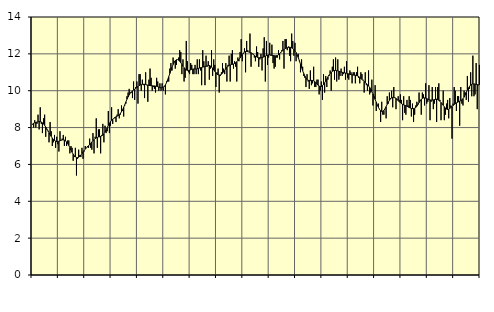
| Category | Piggar | Series 1 |
|---|---|---|
| nan | 8.2 | 8.17 |
| 87.0 | 8 | 8.24 |
| 87.0 | 8.4 | 8.26 |
| 87.0 | 8 | 8.28 |
| 87.0 | 8.2 | 8.3 |
| 87.0 | 8.7 | 8.32 |
| 87.0 | 7.9 | 8.33 |
| 87.0 | 9.1 | 8.32 |
| 87.0 | 8.2 | 8.3 |
| 87.0 | 7.7 | 8.26 |
| 87.0 | 8.5 | 8.2 |
| 87.0 | 8.7 | 8.12 |
| nan | 7.5 | 8.03 |
| 88.0 | 7.9 | 7.93 |
| 88.0 | 7.8 | 7.83 |
| 88.0 | 7.2 | 7.72 |
| 88.0 | 8.3 | 7.62 |
| 88.0 | 7.8 | 7.52 |
| 88.0 | 7 | 7.43 |
| 88.0 | 7.2 | 7.35 |
| 88.0 | 7.6 | 7.3 |
| 88.0 | 6.9 | 7.26 |
| 88.0 | 7.5 | 7.24 |
| 88.0 | 7.1 | 7.24 |
| nan | 6.7 | 7.26 |
| 89.0 | 7.8 | 7.28 |
| 89.0 | 7.3 | 7.31 |
| 89.0 | 7.4 | 7.33 |
| 89.0 | 7.6 | 7.33 |
| 89.0 | 7 | 7.32 |
| 89.0 | 7.5 | 7.28 |
| 89.0 | 7 | 7.22 |
| 89.0 | 7.3 | 7.13 |
| 89.0 | 7.3 | 7.03 |
| 89.0 | 6.6 | 6.91 |
| 89.0 | 7 | 6.78 |
| nan | 6.9 | 6.66 |
| 90.0 | 6.2 | 6.56 |
| 90.0 | 6.4 | 6.47 |
| 90.0 | 6.9 | 6.41 |
| 90.0 | 5.4 | 6.37 |
| 90.0 | 6.3 | 6.37 |
| 90.0 | 6.8 | 6.39 |
| 90.0 | 6.5 | 6.44 |
| 90.0 | 6.4 | 6.51 |
| 90.0 | 6.9 | 6.59 |
| 90.0 | 6.3 | 6.68 |
| 90.0 | 6.7 | 6.76 |
| nan | 7 | 6.83 |
| 91.0 | 6.9 | 6.89 |
| 91.0 | 7 | 6.95 |
| 91.0 | 6.9 | 7.01 |
| 91.0 | 7.4 | 7.07 |
| 91.0 | 6.9 | 7.14 |
| 91.0 | 6.8 | 7.22 |
| 91.0 | 7.7 | 7.28 |
| 91.0 | 6.6 | 7.34 |
| 91.0 | 7.5 | 7.4 |
| 91.0 | 8.5 | 7.44 |
| 91.0 | 6.9 | 7.46 |
| nan | 7.9 | 7.49 |
| 92.0 | 7.9 | 7.5 |
| 92.0 | 6.6 | 7.52 |
| 92.0 | 7.6 | 7.55 |
| 92.0 | 8.2 | 7.59 |
| 92.0 | 7.2 | 7.66 |
| 92.0 | 8.1 | 7.76 |
| 92.0 | 7.7 | 7.87 |
| 92.0 | 7.8 | 7.99 |
| 92.0 | 8.9 | 8.12 |
| 92.0 | 7.7 | 8.23 |
| 92.0 | 8.1 | 8.32 |
| nan | 9.1 | 8.39 |
| 93.0 | 8.2 | 8.45 |
| 93.0 | 8.5 | 8.5 |
| 93.0 | 8.5 | 8.55 |
| 93.0 | 8.3 | 8.58 |
| 93.0 | 8.7 | 8.62 |
| 93.0 | 9 | 8.65 |
| 93.0 | 8.5 | 8.7 |
| 93.0 | 8.7 | 8.77 |
| 93.0 | 9.2 | 8.86 |
| 93.0 | 8.9 | 8.97 |
| 93.0 | 8.6 | 9.1 |
| nan | 9.2 | 9.24 |
| 94.0 | 9.3 | 9.39 |
| 94.0 | 9.7 | 9.54 |
| 94.0 | 9.9 | 9.66 |
| 94.0 | 10.1 | 9.78 |
| 94.0 | 9.9 | 9.87 |
| 94.0 | 9.9 | 9.94 |
| 94.0 | 9.6 | 9.99 |
| 94.0 | 10.5 | 10.04 |
| 94.0 | 9.5 | 10.08 |
| 94.0 | 10.2 | 10.13 |
| 94.0 | 10.5 | 10.18 |
| nan | 9.3 | 10.23 |
| 95.0 | 10.9 | 10.27 |
| 95.0 | 10.9 | 10.31 |
| 95.0 | 10 | 10.33 |
| 95.0 | 10.6 | 10.35 |
| 95.0 | 10.3 | 10.35 |
| 95.0 | 9.6 | 10.35 |
| 95.0 | 11 | 10.34 |
| 95.0 | 10.3 | 10.32 |
| 95.0 | 9.4 | 10.3 |
| 95.0 | 10.6 | 10.29 |
| 95.0 | 11.2 | 10.28 |
| nan | 10.7 | 10.27 |
| 96.0 | 10 | 10.27 |
| 96.0 | 10.2 | 10.26 |
| 96.0 | 10.1 | 10.26 |
| 96.0 | 9.9 | 10.25 |
| 96.0 | 10.7 | 10.24 |
| 96.0 | 10.5 | 10.22 |
| 96.0 | 10 | 10.2 |
| 96.0 | 10.4 | 10.18 |
| 96.0 | 10 | 10.16 |
| 96.0 | 10.4 | 10.16 |
| 96.0 | 10 | 10.18 |
| nan | 10.2 | 10.23 |
| 97.0 | 9.8 | 10.31 |
| 97.0 | 10.5 | 10.44 |
| 97.0 | 10.5 | 10.59 |
| 97.0 | 10.5 | 10.76 |
| 97.0 | 11.2 | 10.93 |
| 97.0 | 11.5 | 11.1 |
| 97.0 | 11.1 | 11.27 |
| 97.0 | 11.8 | 11.42 |
| 97.0 | 11.6 | 11.54 |
| 97.0 | 11.2 | 11.63 |
| 97.0 | 11.4 | 11.68 |
| nan | 11.7 | 11.69 |
| 98.0 | 11.8 | 11.66 |
| 98.0 | 12.2 | 11.6 |
| 98.0 | 12.1 | 11.52 |
| 98.0 | 10.9 | 11.43 |
| 98.0 | 11.7 | 11.33 |
| 98.0 | 10.5 | 11.25 |
| 98.0 | 10.7 | 11.18 |
| 98.0 | 12.7 | 11.13 |
| 98.0 | 11.6 | 11.1 |
| 98.0 | 11 | 11.09 |
| 98.0 | 10.9 | 11.11 |
| nan | 11.5 | 11.13 |
| 99.0 | 11.4 | 11.16 |
| 99.0 | 10.9 | 11.17 |
| 99.0 | 10.9 | 11.18 |
| 99.0 | 11.4 | 11.18 |
| 99.0 | 10.9 | 11.18 |
| 99.0 | 11.7 | 11.19 |
| 99.0 | 10.9 | 11.21 |
| 99.0 | 11.7 | 11.23 |
| 99.0 | 11.1 | 11.25 |
| 99.0 | 10.3 | 11.26 |
| 99.0 | 12.2 | 11.28 |
| nan | 11.6 | 11.3 |
| 0.0 | 10.3 | 11.31 |
| 0.0 | 11.9 | 11.33 |
| 0.0 | 11.3 | 11.35 |
| 0.0 | 11.6 | 11.37 |
| 0.0 | 10.6 | 11.37 |
| 0.0 | 11.2 | 11.34 |
| 0.0 | 12.2 | 11.29 |
| 0.0 | 10.8 | 11.22 |
| 0.0 | 11.7 | 11.13 |
| 0.0 | 11.4 | 11.05 |
| 0.0 | 10.2 | 10.97 |
| nan | 11 | 10.9 |
| 1.0 | 11.2 | 10.86 |
| 1.0 | 9.9 | 10.85 |
| 1.0 | 10.8 | 10.86 |
| 1.0 | 11 | 10.89 |
| 1.0 | 11.5 | 10.95 |
| 1.0 | 11.2 | 11.02 |
| 1.0 | 10.9 | 11.1 |
| 1.0 | 11.5 | 11.19 |
| 1.0 | 10.5 | 11.27 |
| 1.0 | 11.4 | 11.33 |
| 1.0 | 11.9 | 11.37 |
| nan | 10.5 | 11.4 |
| 2.0 | 12 | 11.42 |
| 2.0 | 12.2 | 11.43 |
| 2.0 | 11.2 | 11.45 |
| 2.0 | 11.6 | 11.48 |
| 2.0 | 11.3 | 11.52 |
| 2.0 | 10.5 | 11.57 |
| 2.0 | 11.8 | 11.63 |
| 2.0 | 11.6 | 11.7 |
| 2.0 | 12.1 | 11.78 |
| 2.0 | 12.8 | 11.88 |
| 2.0 | 11.6 | 11.96 |
| nan | 12 | 12.04 |
| 3.0 | 12.3 | 12.1 |
| 3.0 | 11 | 12.13 |
| 3.0 | 12.7 | 12.13 |
| 3.0 | 12.2 | 12.12 |
| 3.0 | 12.1 | 12.1 |
| 3.0 | 13.1 | 12.08 |
| 3.0 | 11.3 | 12.06 |
| 3.0 | 12 | 12.02 |
| 3.0 | 12 | 11.97 |
| 3.0 | 11.8 | 11.92 |
| 3.0 | 11.6 | 11.87 |
| nan | 12.4 | 11.84 |
| 4.0 | 12.1 | 11.81 |
| 4.0 | 11.3 | 11.79 |
| 4.0 | 11.7 | 11.79 |
| 4.0 | 12 | 11.79 |
| 4.0 | 11.1 | 11.8 |
| 4.0 | 12.3 | 11.82 |
| 4.0 | 12.9 | 11.85 |
| 4.0 | 10.5 | 11.88 |
| 4.0 | 12.7 | 11.91 |
| 4.0 | 11.4 | 11.93 |
| 4.0 | 11.8 | 11.95 |
| nan | 12.6 | 11.95 |
| 5.0 | 11.9 | 11.94 |
| 5.0 | 12.5 | 11.92 |
| 5.0 | 11.5 | 11.91 |
| 5.0 | 11.2 | 11.9 |
| 5.0 | 11.3 | 11.89 |
| 5.0 | 11.8 | 11.9 |
| 5.0 | 11.8 | 11.91 |
| 5.0 | 12.2 | 11.95 |
| 5.0 | 11.7 | 12.01 |
| 5.0 | 12.1 | 12.07 |
| 5.0 | 12.2 | 12.14 |
| nan | 12.7 | 12.19 |
| 6.0 | 11.2 | 12.24 |
| 6.0 | 12.8 | 12.28 |
| 6.0 | 12.8 | 12.31 |
| 6.0 | 12.2 | 12.33 |
| 6.0 | 12.4 | 12.35 |
| 6.0 | 11.9 | 12.36 |
| 6.0 | 11.6 | 12.35 |
| 6.0 | 13.1 | 12.33 |
| 6.0 | 12.7 | 12.29 |
| 6.0 | 11.9 | 12.24 |
| 6.0 | 12.6 | 12.16 |
| nan | 11.6 | 12.07 |
| 7.0 | 11.9 | 11.94 |
| 7.0 | 12 | 11.8 |
| 7.0 | 11.6 | 11.63 |
| 7.0 | 11 | 11.44 |
| 7.0 | 11.7 | 11.26 |
| 7.0 | 11.3 | 11.08 |
| 7.0 | 10.8 | 10.93 |
| 7.0 | 10.7 | 10.8 |
| 7.0 | 10.2 | 10.69 |
| 7.0 | 10.9 | 10.61 |
| 7.0 | 10.5 | 10.57 |
| nan | 10.1 | 10.55 |
| 8.0 | 11.1 | 10.55 |
| 8.0 | 10.3 | 10.56 |
| 8.0 | 10.4 | 10.55 |
| 8.0 | 11.3 | 10.54 |
| 8.0 | 10.2 | 10.5 |
| 8.0 | 10.2 | 10.44 |
| 8.0 | 10.6 | 10.37 |
| 8.0 | 10.6 | 10.3 |
| 8.0 | 9.8 | 10.25 |
| 8.0 | 10 | 10.23 |
| 8.0 | 10.5 | 10.23 |
| nan | 9.5 | 10.27 |
| 9.0 | 10.9 | 10.34 |
| 9.0 | 9.9 | 10.43 |
| 9.0 | 10.8 | 10.53 |
| 9.0 | 10.2 | 10.64 |
| 9.0 | 10.6 | 10.75 |
| 9.0 | 10.8 | 10.85 |
| 9.0 | 11.1 | 10.94 |
| 9.0 | 10 | 11 |
| 9.0 | 11.3 | 11.05 |
| 9.0 | 11.7 | 11.08 |
| 9.0 | 10.6 | 11.1 |
| nan | 11.8 | 11.1 |
| 10.0 | 10.5 | 11.09 |
| 10.0 | 11.7 | 11.08 |
| 10.0 | 10.6 | 11.06 |
| 10.0 | 10.8 | 11.03 |
| 10.0 | 11.2 | 11.01 |
| 10.0 | 10.8 | 11 |
| 10.0 | 10.9 | 10.98 |
| 10.0 | 11.3 | 10.97 |
| 10.0 | 10.6 | 10.96 |
| 10.0 | 11.6 | 10.95 |
| 10.0 | 10.7 | 10.93 |
| nan | 10.6 | 10.91 |
| 11.0 | 11.1 | 10.89 |
| 11.0 | 11 | 10.87 |
| 11.0 | 10.4 | 10.86 |
| 11.0 | 11 | 10.85 |
| 11.0 | 11 | 10.84 |
| 11.0 | 10.4 | 10.84 |
| 11.0 | 11 | 10.82 |
| 11.0 | 11.3 | 10.8 |
| 11.0 | 10.7 | 10.77 |
| 11.0 | 10.4 | 10.72 |
| 11.0 | 11 | 10.67 |
| nan | 10.9 | 10.62 |
| 12.0 | 10.6 | 10.56 |
| 12.0 | 9.9 | 10.5 |
| 12.0 | 11 | 10.44 |
| 12.0 | 10.3 | 10.39 |
| 12.0 | 10 | 10.32 |
| 12.0 | 11.1 | 10.26 |
| 12.0 | 9.8 | 10.18 |
| 12.0 | 9.9 | 10.08 |
| 12.0 | 10.6 | 9.96 |
| 12.0 | 9.2 | 9.83 |
| 12.0 | 9.6 | 9.69 |
| nan | 10.3 | 9.53 |
| 13.0 | 8.9 | 9.38 |
| 13.0 | 9.2 | 9.23 |
| 13.0 | 9.3 | 9.1 |
| 13.0 | 9 | 8.99 |
| 13.0 | 8.3 | 8.91 |
| 13.0 | 9.4 | 8.88 |
| 13.0 | 8.7 | 8.88 |
| 13.0 | 8.7 | 8.93 |
| 13.0 | 9 | 9.02 |
| 13.0 | 8.5 | 9.14 |
| 13.0 | 9.7 | 9.26 |
| nan | 9.3 | 9.38 |
| 14.0 | 9.9 | 9.48 |
| 14.0 | 9.6 | 9.56 |
| 14.0 | 10 | 9.61 |
| 14.0 | 9.1 | 9.64 |
| 14.0 | 10.2 | 9.64 |
| 14.0 | 9.6 | 9.62 |
| 14.0 | 9 | 9.58 |
| 14.0 | 9.5 | 9.53 |
| 14.0 | 9.7 | 9.46 |
| 14.0 | 9.5 | 9.4 |
| 14.0 | 9.8 | 9.34 |
| nan | 9.5 | 9.3 |
| 15.0 | 8.4 | 9.26 |
| 15.0 | 9.7 | 9.23 |
| 15.0 | 8.8 | 9.21 |
| 15.0 | 8.7 | 9.19 |
| 15.0 | 9.5 | 9.16 |
| 15.0 | 9.2 | 9.12 |
| 15.0 | 9.7 | 9.09 |
| 15.0 | 9.5 | 9.06 |
| 15.0 | 8.6 | 9.04 |
| 15.0 | 9.3 | 9.03 |
| 15.0 | 8.3 | 9.03 |
| nan | 8.7 | 9.05 |
| 16.0 | 9.2 | 9.09 |
| 16.0 | 9.4 | 9.16 |
| 16.0 | 9.3 | 9.25 |
| 16.0 | 9.9 | 9.35 |
| 16.0 | 9.5 | 9.45 |
| 16.0 | 8.7 | 9.53 |
| 16.0 | 9.9 | 9.58 |
| 16.0 | 9.8 | 9.61 |
| 16.0 | 9.2 | 9.61 |
| 16.0 | 10.4 | 9.6 |
| 16.0 | 9.3 | 9.58 |
| nan | 9.4 | 9.54 |
| 17.0 | 10.3 | 9.52 |
| 17.0 | 8.4 | 9.5 |
| 17.0 | 9.4 | 9.49 |
| 17.0 | 10.2 | 9.49 |
| 17.0 | 9 | 9.5 |
| 17.0 | 9.3 | 9.52 |
| 17.0 | 10.2 | 9.53 |
| 17.0 | 8.3 | 9.54 |
| 17.0 | 10.2 | 9.52 |
| 17.0 | 10.4 | 9.48 |
| 17.0 | 9.5 | 9.43 |
| nan | 8.4 | 9.36 |
| 18.0 | 9.3 | 9.29 |
| 18.0 | 10 | 9.21 |
| 18.0 | 8.4 | 9.13 |
| 18.0 | 8.7 | 9.06 |
| 18.0 | 9.3 | 9 |
| 18.0 | 9.5 | 8.98 |
| 18.0 | 8.5 | 8.99 |
| 18.0 | 9.6 | 9.03 |
| 18.0 | 9.2 | 9.09 |
| 18.0 | 7.4 | 9.14 |
| 18.0 | 9.3 | 9.2 |
| nan | 10.2 | 9.25 |
| 19.0 | 10 | 9.3 |
| 19.0 | 8.9 | 9.34 |
| 19.0 | 9.7 | 9.37 |
| 19.0 | 9.7 | 9.4 |
| 19.0 | 8.1 | 9.43 |
| 19.0 | 10.2 | 9.46 |
| 19.0 | 9.3 | 9.5 |
| 19.0 | 9.2 | 9.57 |
| 19.0 | 10 | 9.65 |
| 19.0 | 9.9 | 9.77 |
| 19.0 | 9.5 | 9.91 |
| nan | 10.8 | 10.04 |
| 20.0 | 9.4 | 10.15 |
| 20.0 | 10.1 | 10.24 |
| 20.0 | 11 | 10.31 |
| 20.0 | 9.7 | 10.35 |
| 20.0 | 11.9 | 10.37 |
| 20.0 | 9.7 | 10.37 |
| 20.0 | 9.8 | 10.36 |
| 20.0 | 11.5 | 10.34 |
| 20.0 | 9 | 10.33 |
| 20.0 | 10.3 | 10.32 |
| 20.0 | 11.4 | 10.33 |